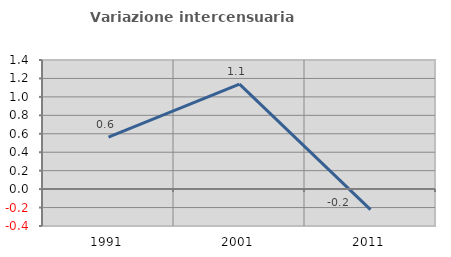
| Category | Variazione intercensuaria annua |
|---|---|
| 1991.0 | 0.565 |
| 2001.0 | 1.138 |
| 2011.0 | -0.222 |